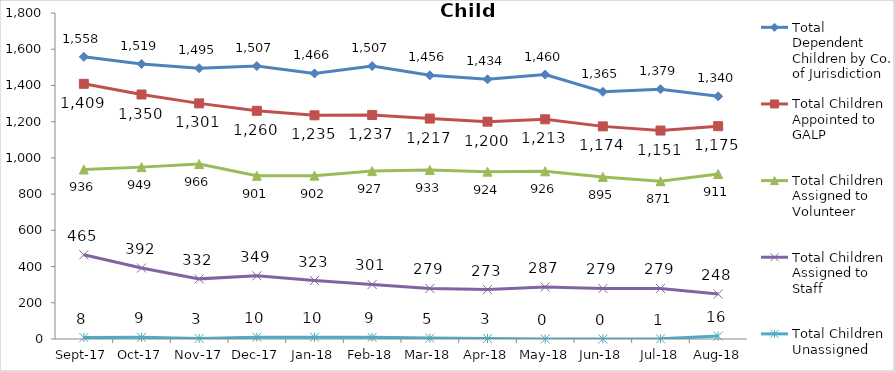
| Category | Total Dependent Children by Co. of Jurisdiction | Total Children Appointed to GALP | Total Children Assigned to Volunteer | Total Children Assigned to Staff | Total Children Unassigned |
|---|---|---|---|---|---|
| 2017-09-01 | 1558 | 1409 | 936 | 465 | 8 |
| 2017-10-01 | 1519 | 1350 | 949 | 392 | 9 |
| 2017-11-01 | 1495 | 1301 | 966 | 332 | 3 |
| 2017-12-01 | 1507 | 1260 | 901 | 349 | 10 |
| 2018-01-01 | 1466 | 1235 | 902 | 323 | 10 |
| 2018-02-01 | 1507 | 1237 | 927 | 301 | 9 |
| 2018-03-01 | 1456 | 1217 | 933 | 279 | 5 |
| 2018-04-01 | 1434 | 1200 | 924 | 273 | 3 |
| 2018-05-01 | 1460 | 1213 | 926 | 287 | 0 |
| 2018-06-01 | 1365 | 1174 | 895 | 279 | 0 |
| 2018-07-01 | 1379 | 1151 | 871 | 279 | 1 |
| 2018-08-01 | 1340 | 1175 | 911 | 248 | 16 |